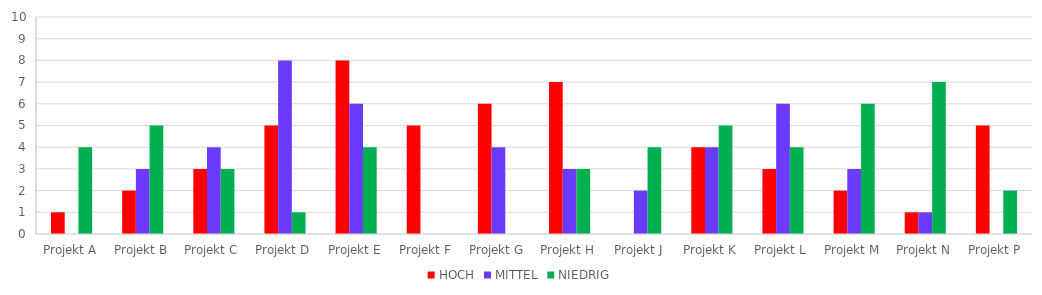
| Category | HOCH | MITTEL | NIEDRIG |
|---|---|---|---|
| Projekt A | 1 | 0 | 4 |
| Projekt B | 2 | 3 | 5 |
| Projekt C | 3 | 4 | 3 |
| Projekt D | 5 | 8 | 1 |
| Projekt E | 8 | 6 | 4 |
| Projekt F | 5 | 0 | 0 |
| Projekt G | 6 | 4 | 0 |
| Projekt H | 7 | 3 | 3 |
| Projekt J | 0 | 2 | 4 |
| Projekt K | 4 | 4 | 5 |
| Projekt L | 3 | 6 | 4 |
| Projekt M | 2 | 3 | 6 |
| Projekt N | 1 | 1 | 7 |
| Projekt P | 5 | 0 | 2 |